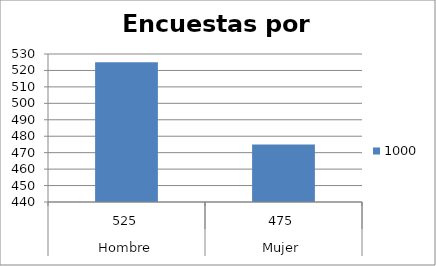
| Category | 1000 |
|---|---|
| 0 | 525 |
| 1 | 475 |